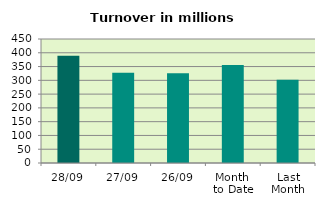
| Category | Series 0 |
|---|---|
| 28/09 | 389.242 |
| 27/09 | 327.778 |
| 26/09 | 325.424 |
| Month 
to Date | 355.592 |
| Last
Month | 301.741 |